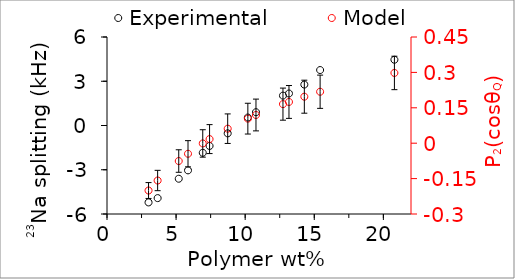
| Category | Experimental |
|---|---|
| 3.006589785831961 | -5.214 |
| 3.664416586306654 | -4.923 |
| 5.191472562179234 | -3.609 |
| 5.86234493797519 | -3.042 |
| 6.929320926549199 | -1.849 |
| 7.422559906487434 | -1.386 |
| 8.734580183048148 | -0.532 |
| 10.193679918450561 | 0.541 |
| 10.781563126252506 | 0.902 |
| 12.734556188066627 | 2.026 |
| 13.169464428457237 | 2.171 |
| 14.280786478095894 | 2.776 |
| 15.423443634324174 | 3.76 |
| 20.8 | 4.459 |